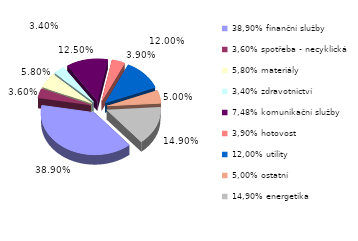
| Category | Series 0 |
|---|---|
| 38,90% finanční služby | 0.389 |
| 3,60% spotřeba - necyklická | 0.036 |
| 5,80% materiály | 0.058 |
| 3,40% zdravotnictví | 0.034 |
| 7,48% komunikační služby | 0.125 |
| 3,90% hotovost | 0.039 |
| 12,00% utility | 0.12 |
| 5,00% ostatní | 0.05 |
| 14,90% energetika | 0.149 |